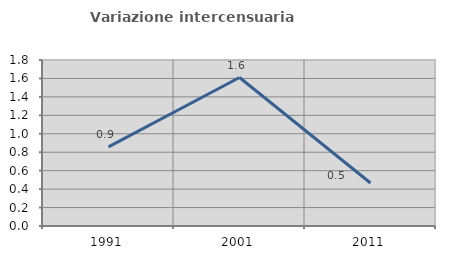
| Category | Variazione intercensuaria annua |
|---|---|
| 1991.0 | 0.859 |
| 2001.0 | 1.61 |
| 2011.0 | 0.466 |